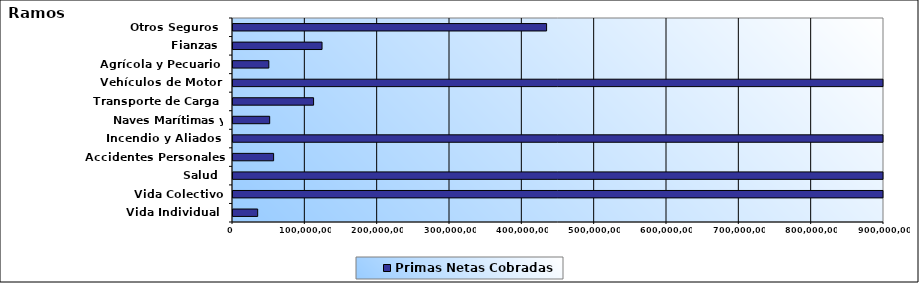
| Category | Primas Netas Cobradas |
|---|---|
| Vida Individual  | 34109230.69 |
| Vida Colectivo | 1234531417.47 |
| Salud  | 1929333959.66 |
| Accidentes Personales | 56156052.51 |
| Incendio y Aliados  | 1639136354.98 |
| Naves Marítimas y Aéreas  | 50705470.92 |
| Transporte de Carga  | 111399690.99 |
| Vehículos de Motor  | 1758935657.19 |
| Agrícola y Pecuario  | 49549222.75 |
| Fianzas  | 123095852.2 |
| Otros Seguros  | 433548519.44 |